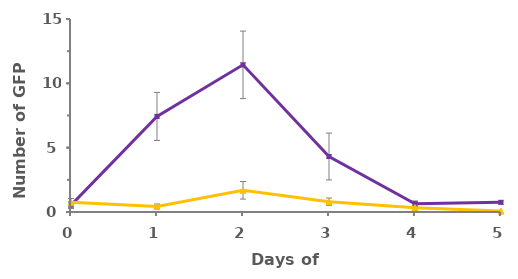
| Category | dnj-21 RNAi | Ctrl. |
|---|---|---|
| 0.0 | 0.533 | 0.75 |
| 1.0 | 7.429 | 0.429 |
| 2.0 | 11.438 | 1.688 |
| 3.0 | 4.312 | 0.8 |
| 4.0 | 0.643 | 0.333 |
| 5.0 | 0.75 | 0.067 |